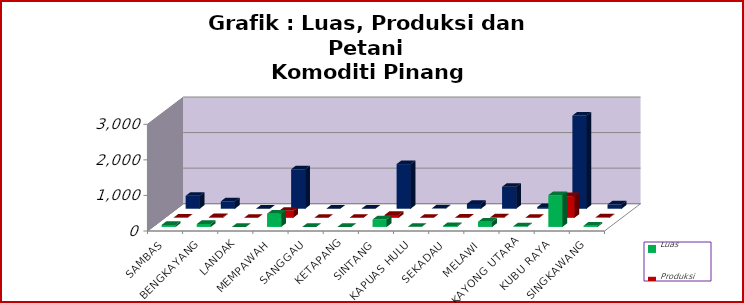
| Category | Luas | Produksi | Petani |
|---|---|---|---|
| SAMBAS | 56 | 8 | 363 |
| BENGKAYANG | 82 | 17 | 208 |
| LANDAK | 0 | 0 | 0 |
| MEMPAWAH | 371 | 196 | 1109 |
| SANGGAU | 0 | 0 | 0 |
| KETAPANG | 0 | 0 | 0 |
| SINTANG | 209 | 80 | 1255 |
| KAPUAS HULU | 3 | 1 | 10 |
| SEKADAU | 25 | 2 | 136 |
| MELAWI | 146 | 10 | 617 |
| KAYONG UTARA | 17 | 1 | 47 |
| KUBU RAYA | 895 | 608 | 2620 |
| SINGKAWANG | 33 | 13 | 119 |